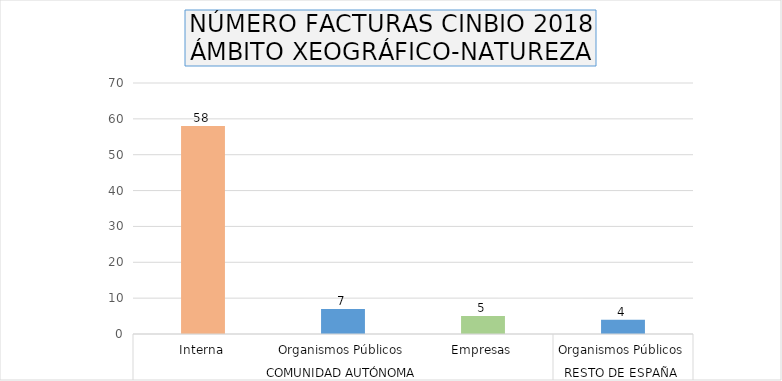
| Category | Series 0 |
|---|---|
| 0 | 58 |
| 1 | 7 |
| 2 | 5 |
| 3 | 4 |